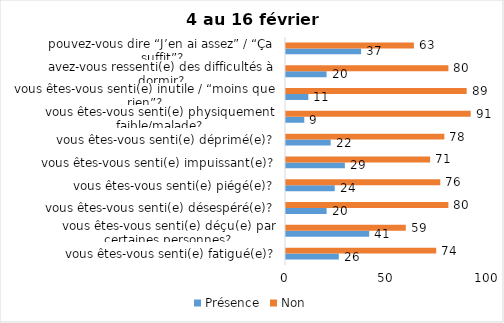
| Category | Présence | Non |
|---|---|---|
| vous êtes-vous senti(e) fatigué(e)? | 26 | 74 |
| vous êtes-vous senti(e) déçu(e) par certaines personnes? | 41 | 59 |
| vous êtes-vous senti(e) désespéré(e)? | 20 | 80 |
| vous êtes-vous senti(e) piégé(e)? | 24 | 76 |
| vous êtes-vous senti(e) impuissant(e)? | 29 | 71 |
| vous êtes-vous senti(e) déprimé(e)? | 22 | 78 |
| vous êtes-vous senti(e) physiquement faible/malade? | 9 | 91 |
| vous êtes-vous senti(e) inutile / “moins que rien”? | 11 | 89 |
| avez-vous ressenti(e) des difficultés à dormir? | 20 | 80 |
| pouvez-vous dire “J’en ai assez” / “Ça suffit”? | 37 | 63 |